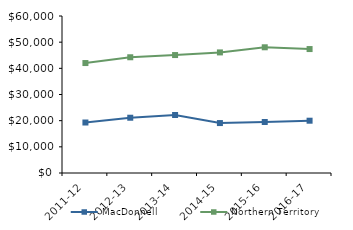
| Category | MacDonnell | Northern Territory |
|---|---|---|
| 2011-12 | 19296 | 42021 |
| 2012-13 | 21123.21 | 44232.02 |
| 2013-14 | 22168.95 | 45075.51 |
| 2014-15 | 19084 | 46083.65 |
| 2015-16 | 19499.81 | 48046.27 |
| 2016-17 | 19986.41 | 47367.05 |